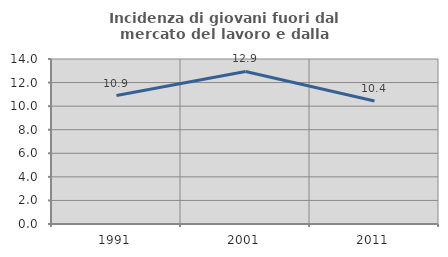
| Category | Incidenza di giovani fuori dal mercato del lavoro e dalla formazione  |
|---|---|
| 1991.0 | 10.902 |
| 2001.0 | 12.946 |
| 2011.0 | 10.435 |